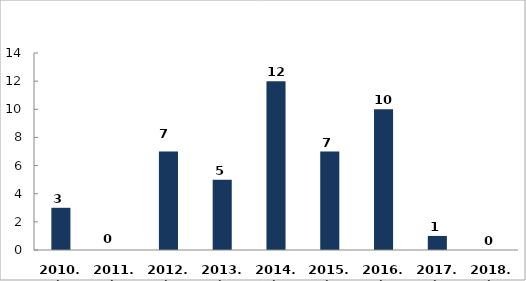
| Category | Embercsempészés bűncselekmény |
|---|---|
| 2010. év | 3 |
| 2011. év | 0 |
| 2012. év | 7 |
| 2013. év | 5 |
| 2014. év | 12 |
| 2015. év | 7 |
| 2016. év | 10 |
| 2017. év | 1 |
| 2018. év | 0 |